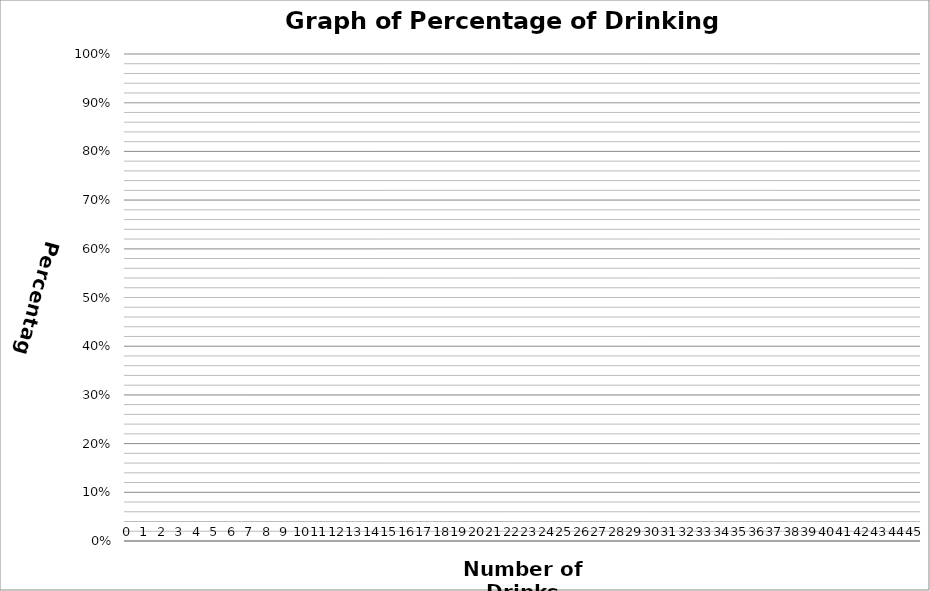
| Category | 0 | 1 | 2 | 3 | 4 | 5 | 6 | 7 | 8 | 9 | 10 | 11 | 12 | 13 | 14 | 15 | 16 | 17 | 18 | 19 | 20 | 21 | 22 | 23 | 24 | 25 | 26 | 27 | 28 | 29 | 30 | 31 | 32 | 33 | 34 | 35 | 36 | 37 | 38 | 39 | 40 | 41 | 42 | 43 | 44 | 45 |
|---|---|---|---|---|---|---|---|---|---|---|---|---|---|---|---|---|---|---|---|---|---|---|---|---|---|---|---|---|---|---|---|---|---|---|---|---|---|---|---|---|---|---|---|---|---|---|
| 0 | 0 | 0 | 0 | 0 | 0 | 0 | 0 | 0 | 0 | 0 | 0 | 0 | 0 | 0 | 0 | 0 | 0 | 0 | 0 | 0 | 0 | 0 | 0 | 0 | 0 | 0 | 0 | 0 | 0 | 0 | 0 | 0 | 0 | 0 | 0 | 0 | 0 | 0 | 0 | 0 | 0 | 0 | 0 | 0 | 0 | 0 |